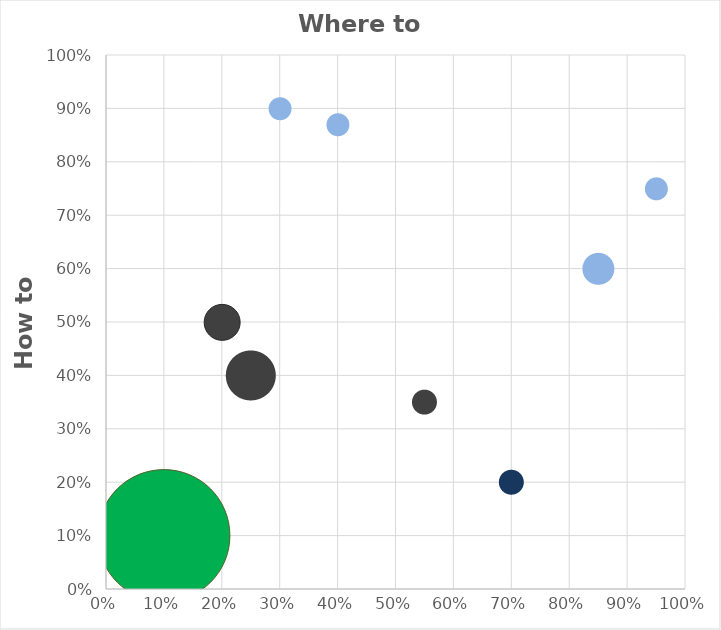
| Category | Where |
|---|---|
| 0.3 | 0.9 |
| 0.4 | 0.87 |
| 0.95 | 0.75 |
| 0.85 | 0.6 |
| 0.25 | 0.4 |
| 0.2 | 0.5 |
| 0.55 | 0.35 |
| 0.7 | 0.2 |
| 0.1 | 0.1 |